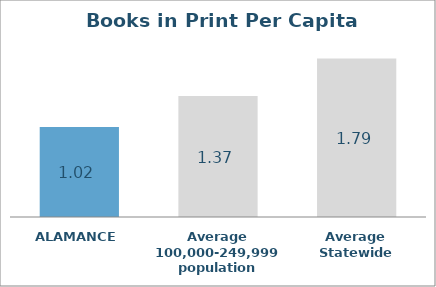
| Category | Series 0 |
|---|---|
| ALAMANCE | 1.016 |
| Average 100,000-249,999 population | 1.367 |
| Average Statewide | 1.792 |